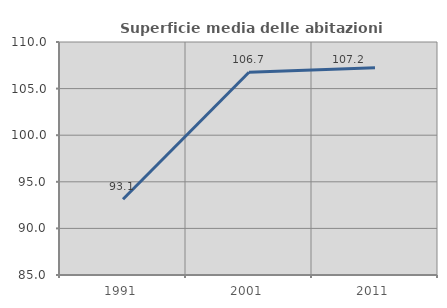
| Category | Superficie media delle abitazioni occupate |
|---|---|
| 1991.0 | 93.123 |
| 2001.0 | 106.747 |
| 2011.0 | 107.229 |